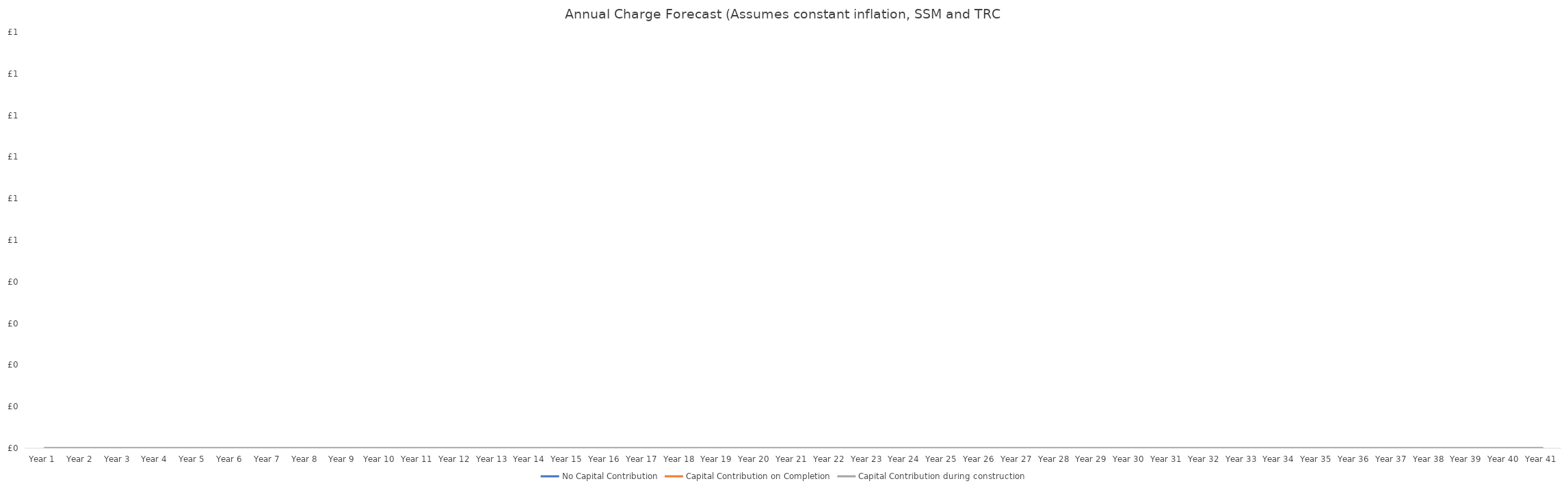
| Category | No Capital Contribution | Capital Contribution on Completion | Capital Contribution during construction |
|---|---|---|---|
| Year 1 | 0 | 0 | 0 |
| Year 2 | 0 | 0 | 0 |
| Year 3 | 0 | 0 | 0 |
| Year 4 | 0 | 0 | 0 |
| Year 5 | 0 | 0 | 0 |
| Year 6 | 0 | 0 | 0 |
| Year 7 | 0 | 0 | 0 |
| Year 8 | 0 | 0 | 0 |
| Year 9 | 0 | 0 | 0 |
| Year 10 | 0 | 0 | 0 |
| Year 11 | 0 | 0 | 0 |
| Year 12 | 0 | 0 | 0 |
| Year 13 | 0 | 0 | 0 |
| Year 14 | 0 | 0 | 0 |
| Year 15 | 0 | 0 | 0 |
| Year 16 | 0 | 0 | 0 |
| Year 17 | 0 | 0 | 0 |
| Year 18 | 0 | 0 | 0 |
| Year 19 | 0 | 0 | 0 |
| Year 20 | 0 | 0 | 0 |
| Year 21 | 0 | 0 | 0 |
| Year 22 | 0 | 0 | 0 |
| Year 23 | 0 | 0 | 0 |
| Year 24 | 0 | 0 | 0 |
| Year 25 | 0 | 0 | 0 |
| Year 26 | 0 | 0 | 0 |
| Year 27 | 0 | 0 | 0 |
| Year 28 | 0 | 0 | 0 |
| Year 29 | 0 | 0 | 0 |
| Year 30 | 0 | 0 | 0 |
| Year 31 | 0 | 0 | 0 |
| Year 32 | 0 | 0 | 0 |
| Year 33 | 0 | 0 | 0 |
| Year 34 | 0 | 0 | 0 |
| Year 35 | 0 | 0 | 0 |
| Year 36 | 0 | 0 | 0 |
| Year 37 | 0 | 0 | 0 |
| Year 38 | 0 | 0 | 0 |
| Year 39 | 0 | 0 | 0 |
| Year 40 | 0 | 0 | 0 |
| Year 41 | 0 | 0 | 0 |